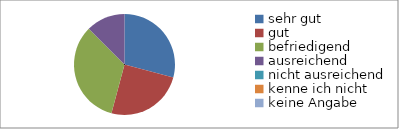
| Category | Series 0 |
|---|---|
| sehr gut | 7 |
| gut | 6 |
| befriedigend | 8 |
| ausreichend | 3 |
| nicht ausreichend | 0 |
| kenne ich nicht | 0 |
| keine Angabe | 0 |